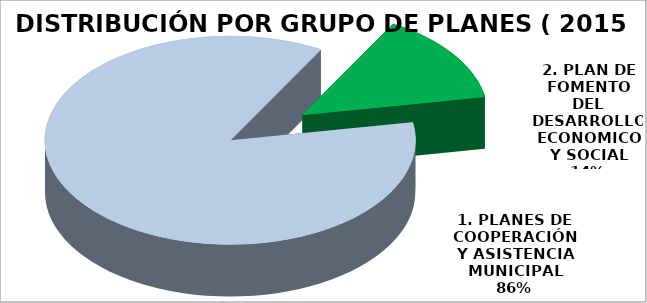
| Category | IMPORTE |
|---|---|
| 1. PLANES DE COOPERACIÓN Y ASISTENCIA MUNICIPAL | 25682760.81 |
| 2. PLAN DE FOMENTO DEL DESARROLLO ECONOMICO Y SOCIAL | 4209058.71 |